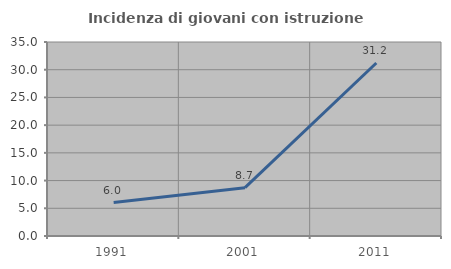
| Category | Incidenza di giovani con istruzione universitaria |
|---|---|
| 1991.0 | 6.028 |
| 2001.0 | 8.723 |
| 2011.0 | 31.217 |